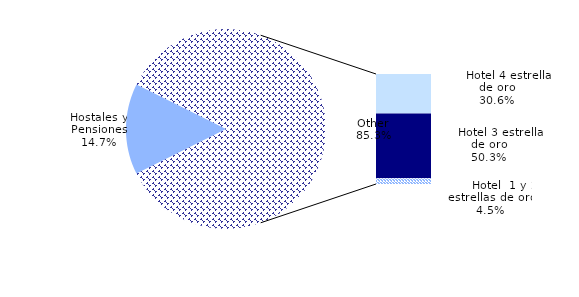
| Category | Número de plazas |
|---|---|
| Hostales y Pensiones | 153086 |
|       Hotel 4 estrellas de oro | 318415 |
|       Hotel 3 estrellas de oro | 523556 |
|       Hotel  1 y 2 estrellas de oro | 46656 |